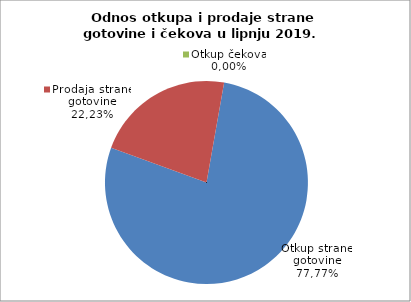
| Category | Otkup strane gotovine |
|---|---|
| 0 | 77.772 |
| 1 | 22.228 |
| 2 | 0 |